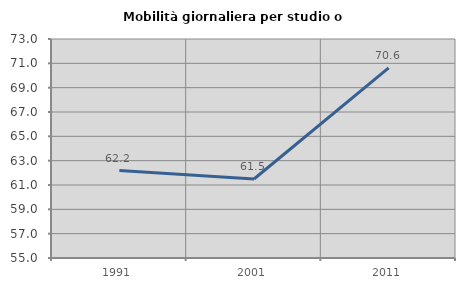
| Category | Mobilità giornaliera per studio o lavoro |
|---|---|
| 1991.0 | 62.186 |
| 2001.0 | 61.492 |
| 2011.0 | 70.633 |